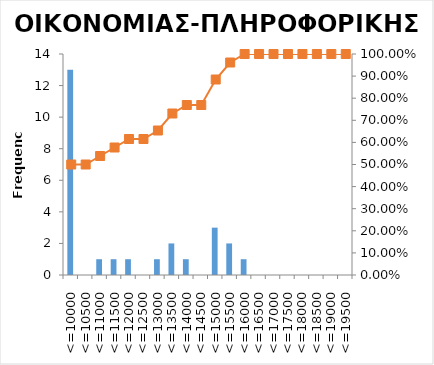
| Category | Series 0 |
|---|---|
| <=10000 | 13 |
| <=10500 | 0 |
| <=11000 | 1 |
| <=11500 | 1 |
| <=12000 | 1 |
| <=12500 | 0 |
| <=13000 | 1 |
| <=13500 | 2 |
| <=14000 | 1 |
| <=14500 | 0 |
| <=15000 | 3 |
| <=15500 | 2 |
| <=16000 | 1 |
| <=16500 | 0 |
| <=17000 | 0 |
| <=17500 | 0 |
| <=18000 | 0 |
| <=18500 | 0 |
| <=19000 | 0 |
| <=19500 | 0 |